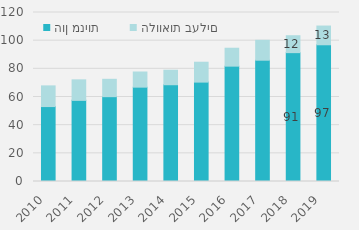
| Category | הון מניות | הלוואות בעלים |
|---|---|---|
| 2010 | 53209.462 | 14683.355 |
| 2011 | 57608.578 | 14568.102 |
| 2012 | 60232.63 | 12332.022 |
| 2013 | 66993.372 | 10751.712 |
| 2014 | 68709.97 | 10301.015 |
| 2015 | 70572.72 | 14122.591 |
| 2016 | 81911.689 | 12721.165 |
| 2017 | 86136.94 | 14123.24 |
| 2018 | 91497.197 | 12008.666 |
| 2019 | 97081 | 13303 |